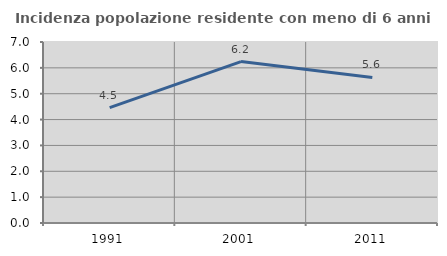
| Category | Incidenza popolazione residente con meno di 6 anni |
|---|---|
| 1991.0 | 4.465 |
| 2001.0 | 6.244 |
| 2011.0 | 5.63 |